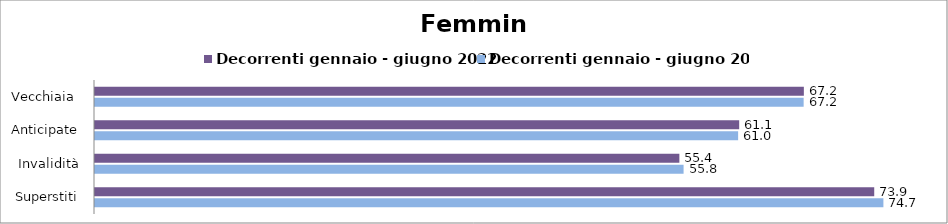
| Category | Decorrenti gennaio - giugno 2022 | Decorrenti gennaio - giugno 2023 |
|---|---|---|
| Vecchiaia  | 67.19 | 67.17 |
| Anticipate | 61.06 | 60.96 |
| Invalidità | 55.39 | 55.79 |
| Superstiti | 73.86 | 74.73 |